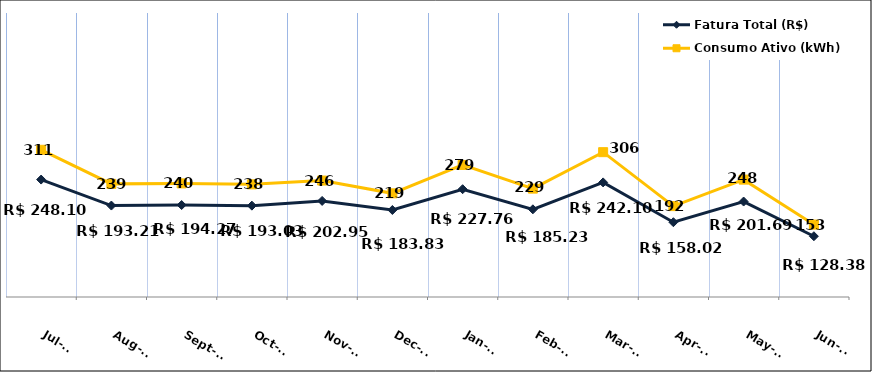
| Category | Fatura Total (R$) |
|---|---|
| 2023-07-01 | 248.1 |
| 2023-08-01 | 193.21 |
| 2023-09-01 | 194.27 |
| 2023-10-01 | 193.03 |
| 2023-11-01 | 202.95 |
| 2023-12-01 | 183.83 |
| 2024-01-01 | 227.76 |
| 2024-02-01 | 185.23 |
| 2024-03-01 | 242.1 |
| 2024-04-01 | 158.02 |
| 2024-05-01 | 201.69 |
| 2024-06-01 | 128.38 |